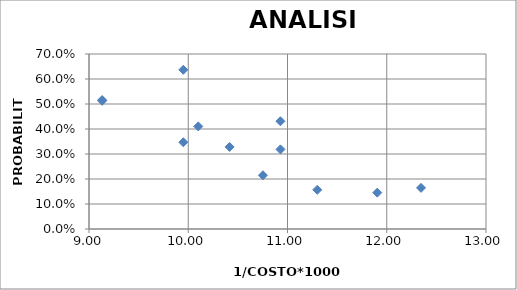
| Category | PROB |
|---|---|
| 9.132420091324201 | 0.516 |
| 9.132420091324201 | 0.513 |
| 9.950248756218905 | 0.637 |
| 9.950248756218905 | 0.347 |
| 10.1010101010101 | 0.41 |
| 10.416666666666666 | 0.328 |
| 10.75268817204301 | 0.215 |
| 10.92896174863388 | 0.318 |
| 10.92896174863388 | 0.431 |
| 11.299435028248588 | 0.157 |
| 11.904761904761905 | 0.145 |
| 12.345679012345679 | 0.165 |